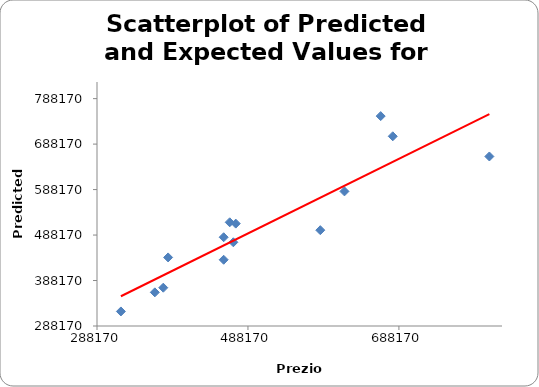
| Category | Series 0 |
|---|---|
| 319840.0 | 320188.981 |
| 364800.0 | 362152.09 |
| 376000.0 | 372380 |
| 456000.0 | 433843.05 |
| 382400.0 | 438957.005 |
| 468800.0 | 472269.404 |
| 456000.0 | 483357.606 |
| 584000.0 | 498890.647 |
| 472000.0 | 513324.427 |
| 464000.0 | 516239.86 |
| 616000.0 | 584155.096 |
| 808000.0 | 660960.011 |
| 680000.0 | 705360.612 |
| 664000.0 | 749761.213 |